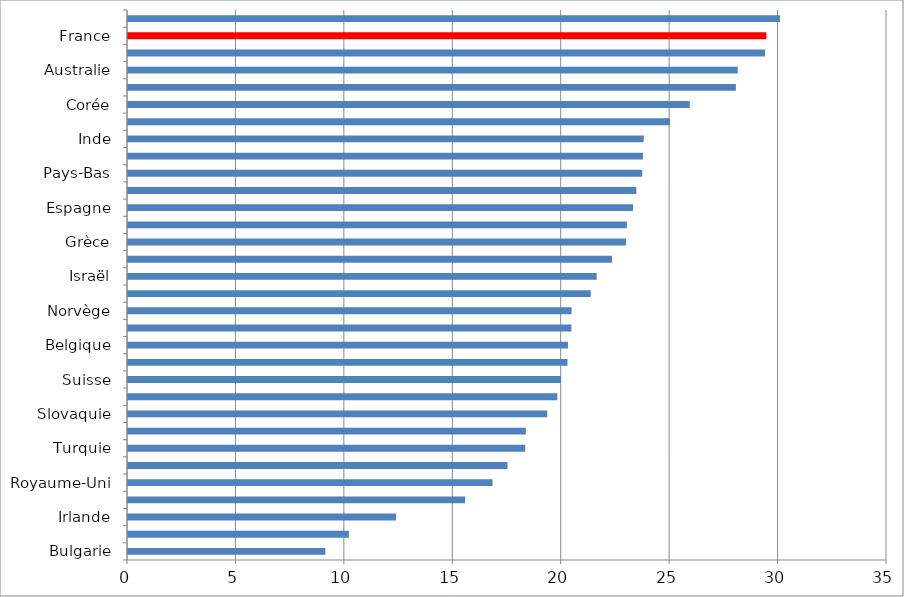
| Category | Taux d'imposition effectif moyen sur les entreprise |
|---|---|
|   Bulgarie | 9.099 |
| Hongrie | 10.185 |
| Irlande | 12.358 |
| Pologne | 15.546 |
| Royaume-Uni | 16.811 |
| Slovénie | 17.501 |
| Turquie | 18.319 |
| Tchèquie | 18.345 |
| Slovaquie | 19.332 |
| Finlande | 19.798 |
| Suisse | 19.966 |
| Danemark | 20.266 |
| Belgique | 20.29 |
| Suède | 20.446 |
| Norvège | 20.455 |
| Italie | 21.339 |
| Israël | 21.613 |
| États-Unis | 22.316 |
| Grèce | 22.962 |
|   Chine | 23.004 |
| Espagne | 23.286 |
| Autriche | 23.442 |
| Pays-Bas | 23.712 |
| Canada | 23.75 |
|   Inde | 23.782 |
| Portugal | 24.996 |
| Corée | 25.905 |
| Allemagne | 28.033 |
| Australie | 28.118 |
| Japon | 29.376 |
| France | 29.437 |
| Mexique | 30.068 |